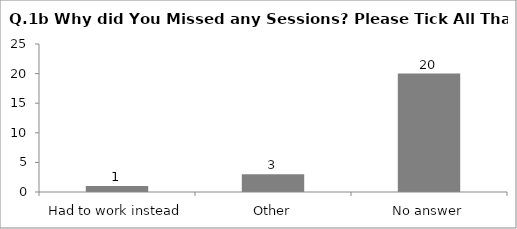
| Category | Q.1b Why did You Missed any Sessions? Please Tick All That Apply |
|---|---|
| Had to work instead | 1 |
| Other | 3 |
| No answer | 20 |